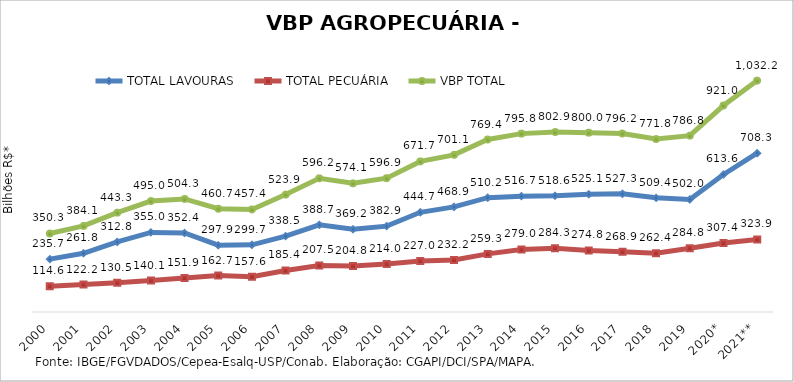
| Category | TOTAL LAVOURAS | TOTAL PECUÁRIA | VBP TOTAL |
|---|---|---|---|
| 2000 | 235.712 | 114.577 | 350.289 |
| 2001 | 261.832 | 122.239 | 384.072 |
| 2002 | 312.768 | 130.491 | 443.259 |
| 2003 | 354.989 | 140.06 | 495.049 |
| 2004 | 352.39 | 151.925 | 504.314 |
| 2005 | 297.93 | 162.748 | 460.678 |
| 2006 | 299.75 | 157.623 | 457.373 |
| 2007 | 338.513 | 185.435 | 523.948 |
| 2008 | 388.696 | 207.546 | 596.243 |
| 2009 | 369.21 | 204.847 | 574.057 |
| 2010 | 382.912 | 214.025 | 596.937 |
| 2011 | 444.704 | 227.026 | 671.731 |
| 2012 | 468.887 | 232.234 | 701.121 |
| 2013 | 510.152 | 259.261 | 769.413 |
| 2014 | 516.716 | 279.039 | 795.755 |
| 2015 | 518.59 | 284.265 | 802.855 |
| 2016 | 525.148 | 274.813 | 799.961 |
| 2017 | 527.329 | 268.908 | 796.236 |
| 2018 | 509.37 | 262.404 | 771.774 |
| 2019 | 502.045 | 284.784 | 786.829 |
| 2020* | 613.606 | 307.383 | 920.989 |
| 2021** | 708.338 | 323.885 | 1032.223 |